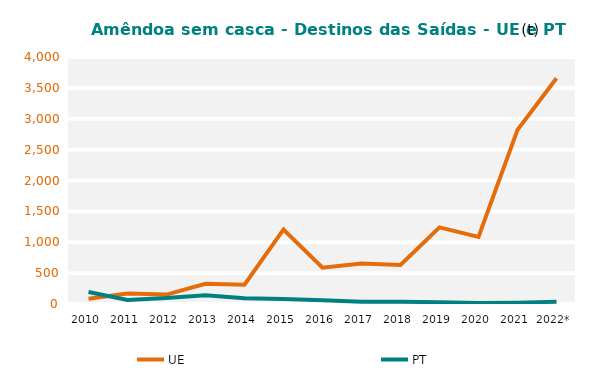
| Category | UE | PT |
|---|---|---|
| 2010 | 85.061 | 193.944 |
| 2011 | 168.8 | 63.87 |
| 2012 | 152.484 | 97.626 |
| 2013 | 325.972 | 140.628 |
| 2014 | 312.524 | 92.643 |
| 2015 | 1207.059 | 79.716 |
| 2016 | 589.046 | 59.071 |
| 2017 | 654.875 | 36.168 |
| 2018 | 630.712 | 37.253 |
| 2019 | 1240.369 | 28.403 |
| 2020 | 1085.81 | 15.497 |
| 2021 | 2819.411 | 22.11 |
| 2022* | 3654.657 | 37.266 |